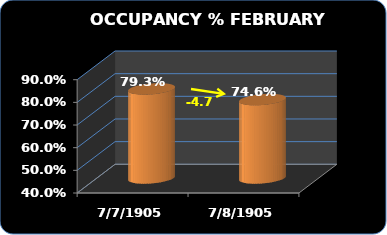
| Category | Occupancy % |
|---|---|
| 2016.0 | 0.746 |
| 2015.0 | 0.793 |